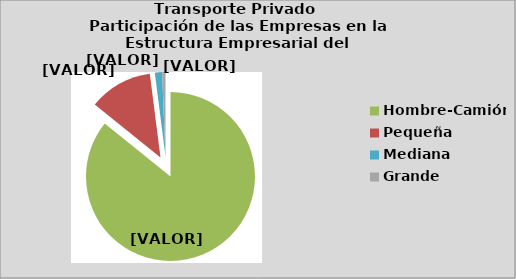
| Category | Series 0 |
|---|---|
| Hombre-Camión | 85.806 |
| Pequeña | 12.173 |
| Mediana | 1.384 |
| Grande | 0.637 |